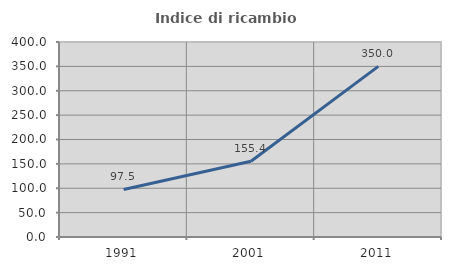
| Category | Indice di ricambio occupazionale  |
|---|---|
| 1991.0 | 97.49 |
| 2001.0 | 155.361 |
| 2011.0 | 350 |